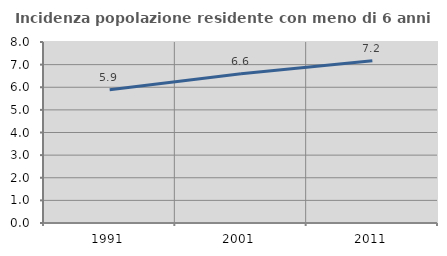
| Category | Incidenza popolazione residente con meno di 6 anni |
|---|---|
| 1991.0 | 5.892 |
| 2001.0 | 6.595 |
| 2011.0 | 7.172 |